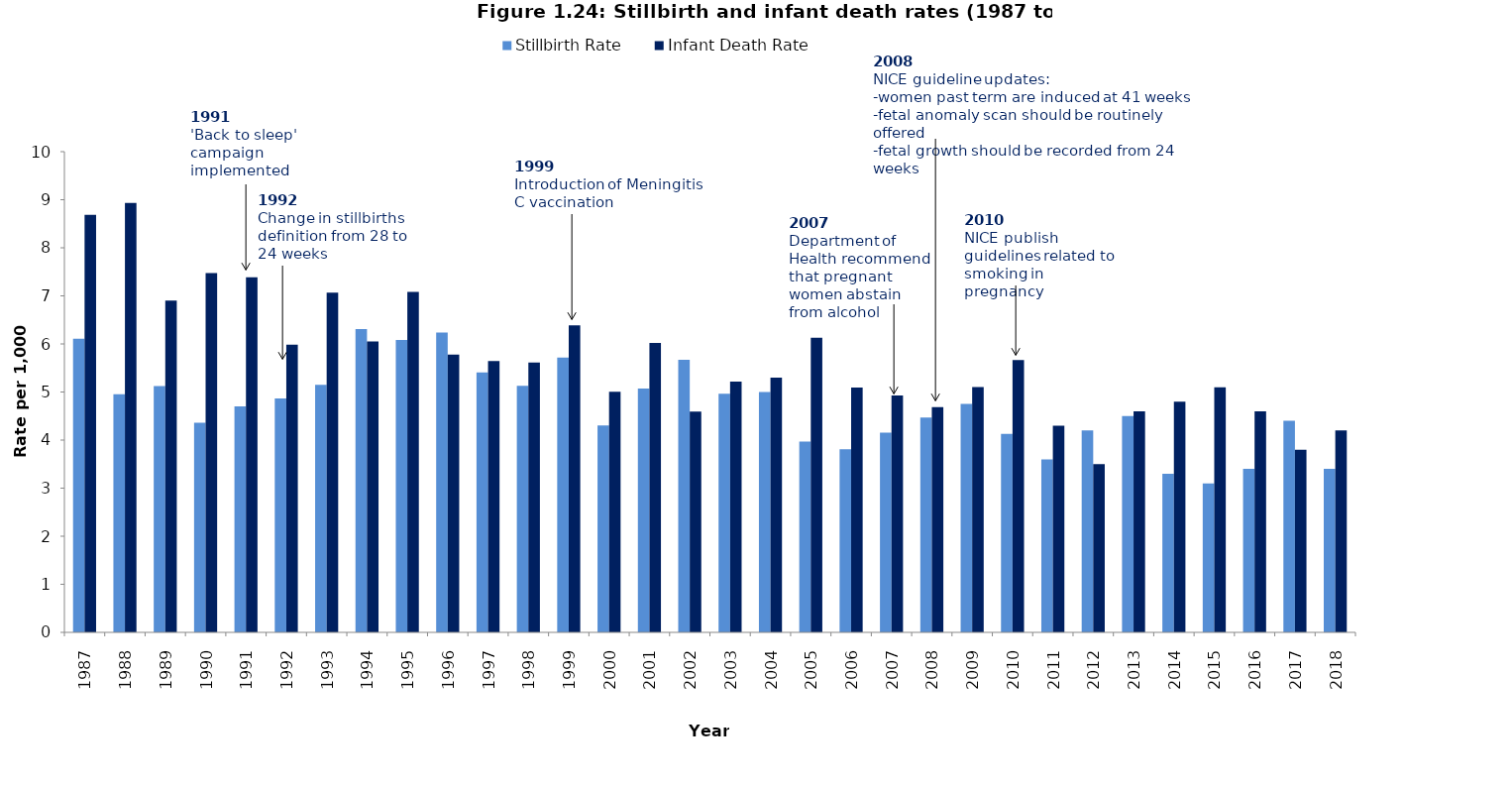
| Category | Stillbirth Rate | Infant Death Rate |
|---|---|---|
| 1987 | 6.11 | 8.685 |
| 1988 | 4.955 | 8.931 |
| 1989 | 5.122 | 6.902 |
| 1990 | 4.362 | 7.472 |
| 1991 | 4.703 | 7.386 |
| 1992 | 4.867 | 5.983 |
| 1993 | 5.151 | 7.066 |
| 1994 | 6.309 | 6.052 |
| 1995 | 6.083 | 7.083 |
| 1996 | 6.236 | 5.777 |
| 1997 | 5.409 | 5.643 |
| 1998 | 5.128 | 5.616 |
| 1999 | 5.717 | 6.387 |
| 2000 | 4.305 | 5.007 |
| 2001 | 5.074 | 6.022 |
| 2002 | 5.673 | 4.593 |
| 2003 | 4.964 | 5.214 |
| 2004 | 5 | 5.3 |
| 2005 | 3.97 | 6.128 |
| 2006 | 3.81 | 5.092 |
| 2007 | 4.154 | 4.926 |
| 2008 | 4.467 | 4.685 |
| 2009 | 4.754 | 5.101 |
| 2010 | 4.131 | 5.666 |
| 2011 | 3.6 | 4.3 |
| 2012 | 4.2 | 3.5 |
| 2013 | 4.5 | 4.6 |
| 2014 | 3.3 | 4.8 |
| 2015 | 3.1 | 5.1 |
| 2016 | 3.4 | 4.6 |
| 2017 | 4.4 | 3.8 |
| 2018 | 3.4 | 4.2 |